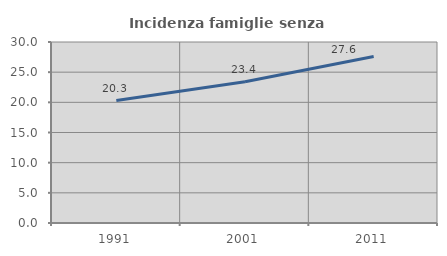
| Category | Incidenza famiglie senza nuclei |
|---|---|
| 1991.0 | 20.3 |
| 2001.0 | 23.421 |
| 2011.0 | 27.589 |